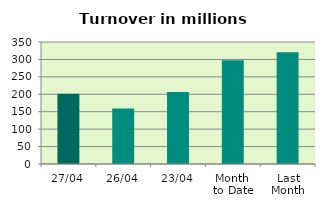
| Category | Series 0 |
|---|---|
| 27/04 | 201.882 |
| 26/04 | 159.045 |
| 23/04 | 206.569 |
| Month 
to Date | 297.576 |
| Last
Month | 320.663 |